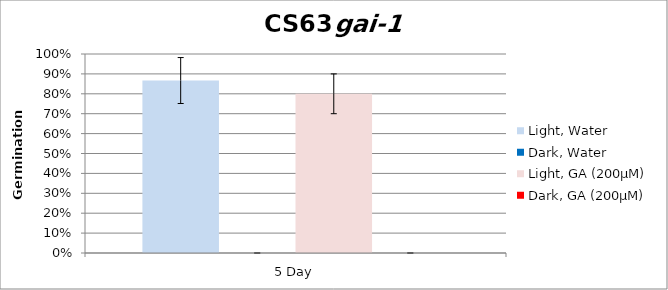
| Category | Light, Water | Dark, Water | Light, GA (200µM) | Dark, GA (200µM) |
|---|---|---|---|---|
| 5 Day | 0.867 | 0 | 0.8 | 0 |